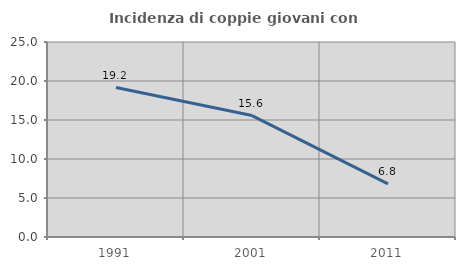
| Category | Incidenza di coppie giovani con figli |
|---|---|
| 1991.0 | 19.157 |
| 2001.0 | 15.568 |
| 2011.0 | 6.805 |